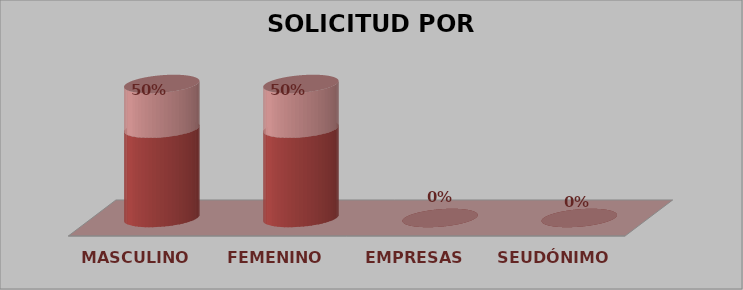
| Category | SOLICITUD POR GÉNERO | Series 1 |
|---|---|---|
| MASCULINO | 1 | 0.5 |
| FEMENINO | 1 | 0.5 |
| EMPRESAS | 0 | 0 |
| SEUDÓNIMO | 0 | 0 |